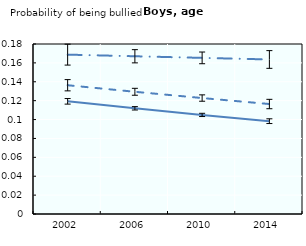
| Category | Healthy weight | Overweight | Obese |
|---|---|---|---|
| 2002.0 | 0.119 | 0.136 | 0.169 |
| 2006.0 | 0.112 | 0.129 | 0.167 |
| 2010.0 | 0.105 | 0.123 | 0.165 |
| 2014.0 | 0.098 | 0.116 | 0.164 |